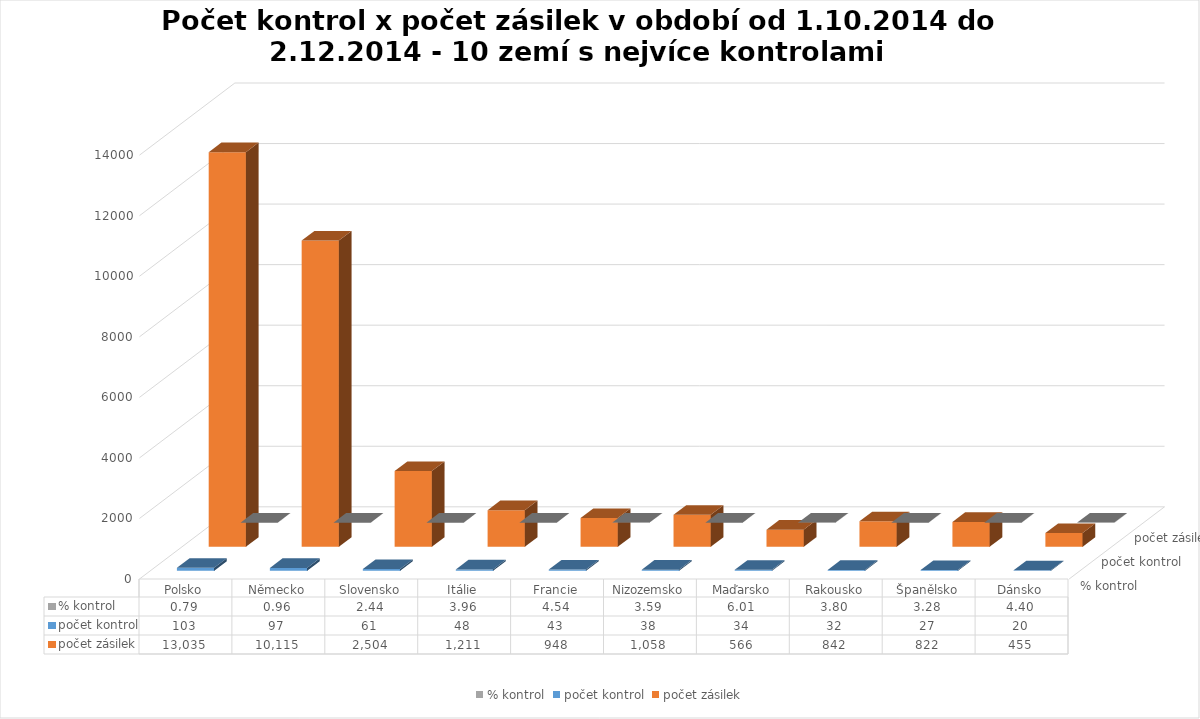
| Category | % kontrol | počet kontrol | počet zásilek |
|---|---|---|---|
| Polsko | 0.79 | 103 | 13035 |
| Německo | 0.959 | 97 | 10115 |
| Slovensko | 2.436 | 61 | 2504 |
| Itálie | 3.964 | 48 | 1211 |
| Francie | 4.536 | 43 | 948 |
| Nizozemsko | 3.592 | 38 | 1058 |
| Maďarsko | 6.007 | 34 | 566 |
| Rakousko | 3.8 | 32 | 842 |
| Španělsko | 3.285 | 27 | 822 |
| Dánsko | 4.396 | 20 | 455 |